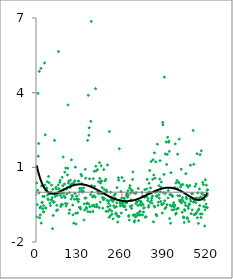
| Category | Series 0 |
|---|---|
| 2.0 | 0.373 |
| 3.0 | -0.991 |
| 4.0 | -0.498 |
| 5.0 | 0.079 |
| 6.0 | 3.972 |
| 7.0 | 1.446 |
| 8.0 | 1.955 |
| 9.0 | -0.031 |
| 10.0 | 4.857 |
| 11.0 | -1.03 |
| 12.0 | -0.632 |
| 13.0 | -0.91 |
| 14.0 | -0.585 |
| 15.0 | 4.978 |
| 16.0 | -1.243 |
| 17.0 | 0.249 |
| 18.0 | -0.422 |
| 19.0 | -0.402 |
| 20.0 | -0.663 |
| 21.0 | -0.166 |
| 22.0 | -0.79 |
| 23.0 | -0.539 |
| 24.0 | -0.791 |
| 25.0 | -0.17 |
| 26.0 | 5.194 |
| 27.0 | 0.29 |
| 28.0 | 2.303 |
| 29.0 | -0.633 |
| 30.0 | -0.636 |
| 31.0 | 0.076 |
| 32.0 | 0.172 |
| 33.0 | 0.142 |
| 34.0 | 0.423 |
| 35.0 | -0.115 |
| 36.0 | -0.266 |
| 37.0 | -0.301 |
| 38.0 | 0.63 |
| 39.0 | -0.058 |
| 40.0 | 0.376 |
| 41.0 | -0.052 |
| 42.0 | -0.432 |
| 43.0 | -0.043 |
| 44.0 | -0.532 |
| 45.0 | 0.003 |
| 46.0 | -0.307 |
| 47.0 | 0.287 |
| 48.0 | -0.319 |
| 49.0 | -0.22 |
| 50.0 | -1.463 |
| 51.0 | 0.117 |
| 52.0 | -0.931 |
| 53.0 | -0.401 |
| 54.0 | -0.395 |
| 55.0 | -0.39 |
| 56.0 | 2.081 |
| 57.0 | -0.071 |
| 58.0 | -0.168 |
| 59.0 | -0.063 |
| 60.0 | 0.198 |
| 61.0 | 0.131 |
| 62.0 | -0.733 |
| 63.0 | -0.526 |
| 64.0 | -0.13 |
| 65.0 | -0.709 |
| 66.0 | -0.064 |
| 67.0 | 0.289 |
| 68.0 | 5.653 |
| 69.0 | 0.136 |
| 70.0 | 0.127 |
| 71.0 | -0.027 |
| 72.0 | 0.397 |
| 73.0 | 0.473 |
| 74.0 | -0.127 |
| 75.0 | -0.575 |
| 76.0 | -0.493 |
| 77.0 | -0.038 |
| 78.0 | -0.214 |
| 79.0 | 0.6 |
| 80.0 | -0.496 |
| 81.0 | 0.259 |
| 82.0 | 1.417 |
| 83.0 | -0.042 |
| 84.0 | 0.103 |
| 85.0 | -0.151 |
| 86.0 | 0.329 |
| 87.0 | 0.804 |
| 88.0 | -0.215 |
| 89.0 | -0.454 |
| 90.0 | 0.972 |
| 91.0 | -0.559 |
| 92.0 | 0.125 |
| 93.0 | -0.07 |
| 94.0 | -0.464 |
| 95.0 | 0.692 |
| 96.0 | 0.961 |
| 97.0 | 3.506 |
| 98.0 | 0.37 |
| 99.0 | 0.443 |
| 100.0 | -0.848 |
| 101.0 | -0.015 |
| 102.0 | -0.713 |
| 103.0 | 0.188 |
| 104.0 | 0.483 |
| 105.0 | 0.296 |
| 106.0 | -0.274 |
| 107.0 | 1.301 |
| 108.0 | 0.328 |
| 109.0 | -0.123 |
| 110.0 | -0.176 |
| 111.0 | -0.516 |
| 112.0 | -0.91 |
| 113.0 | 0.351 |
| 114.0 | -1.244 |
| 115.0 | 0.385 |
| 116.0 | -0.282 |
| 117.0 | 0.459 |
| 118.0 | -0.05 |
| 119.0 | 1.007 |
| 120.0 | -0.843 |
| 121.0 | -1.276 |
| 122.0 | -0.276 |
| 123.0 | -0.159 |
| 124.0 | -0.278 |
| 125.0 | -0.275 |
| 126.0 | -0.831 |
| 127.0 | 0.447 |
| 128.0 | -0.381 |
| 129.0 | -0.289 |
| 130.0 | 0.445 |
| 131.0 | -0.612 |
| 132.0 | 0.156 |
| 133.0 | 0.045 |
| 134.0 | -0.602 |
| 135.0 | -0.677 |
| 136.0 | 0.715 |
| 137.0 | 0.149 |
| 138.0 | 0.653 |
| 139.0 | 0.345 |
| 140.0 | 0.001 |
| 141.0 | 0.06 |
| 142.0 | 0.033 |
| 143.0 | 0.025 |
| 144.0 | 0.176 |
| 145.0 | -1.115 |
| 146.0 | -0.468 |
| 147.0 | -0.718 |
| 148.0 | -0.241 |
| 149.0 | 0.924 |
| 150.0 | 0.563 |
| 151.0 | -0.227 |
| 152.0 | -0.61 |
| 153.0 | -0.657 |
| 154.0 | -0.458 |
| 155.0 | -0.437 |
| 156.0 | 2.081 |
| 157.0 | -0.779 |
| 158.0 | 3.894 |
| 159.0 | -0.473 |
| 160.0 | 2.288 |
| 161.0 | 2.591 |
| 162.0 | 0.541 |
| 163.0 | -0.581 |
| 164.0 | -0.793 |
| 165.0 | -0.098 |
| 166.0 | 2.846 |
| 167.0 | 6.862 |
| 168.0 | 0.265 |
| 169.0 | 0.005 |
| 170.0 | -0.546 |
| 171.0 | -0.189 |
| 172.0 | -0.773 |
| 173.0 | 0.547 |
| 174.0 | -0.522 |
| 175.0 | -0.139 |
| 176.0 | 0.839 |
| 177.0 | 0.236 |
| 178.0 | -0.58 |
| 179.0 | -0.194 |
| 180.0 | 4.161 |
| 181.0 | 1.045 |
| 182.0 | 0.864 |
| 183.0 | -0.492 |
| 184.0 | -0.585 |
| 185.0 | -0.574 |
| 186.0 | 0.907 |
| 187.0 | 0.027 |
| 188.0 | -0.05 |
| 189.0 | 0.422 |
| 190.0 | -0.054 |
| 191.0 | -0.623 |
| 192.0 | 1.189 |
| 193.0 | 0.561 |
| 194.0 | -0.397 |
| 195.0 | 0.37 |
| 196.0 | 0.45 |
| 197.0 | 1.061 |
| 198.0 | -0.061 |
| 199.0 | 0.447 |
| 200.0 | 0.19 |
| 201.0 | -0.214 |
| 202.0 | -0.642 |
| 203.0 | -0.237 |
| 204.0 | -0.305 |
| 205.0 | 0.911 |
| 206.0 | 0.111 |
| 207.0 | -0.257 |
| 208.0 | -0.056 |
| 209.0 | 0.459 |
| 210.0 | -0.013 |
| 211.0 | 0.517 |
| 212.0 | -0.768 |
| 213.0 | 0.087 |
| 214.0 | 0.028 |
| 215.0 | -0.327 |
| 216.0 | 1.095 |
| 217.0 | -0.588 |
| 218.0 | -0.769 |
| 219.0 | -0.443 |
| 220.0 | -0.352 |
| 221.0 | -1.009 |
| 222.0 | 2.44 |
| 223.0 | -0.696 |
| 224.0 | -0.541 |
| 225.0 | -0.941 |
| 226.0 | 0 |
| 227.0 | -0.298 |
| 228.0 | -0.204 |
| 229.0 | -0.755 |
| 230.0 | -0.878 |
| 231.0 | -0.332 |
| 232.0 | -0.369 |
| 233.0 | -1.07 |
| 234.0 | -0.325 |
| 235.0 | -0.544 |
| 236.0 | -0.124 |
| 237.0 | -0.274 |
| 238.0 | -0.614 |
| 239.0 | -0.234 |
| 240.0 | -0.072 |
| 241.0 | -0.866 |
| 242.0 | -0.832 |
| 243.0 | -0.575 |
| 244.0 | -0.423 |
| 245.0 | 0.186 |
| 246.0 | -0.936 |
| 247.0 | -1.2 |
| 248.0 | -0.969 |
| 249.0 | 0.578 |
| 250.0 | 0.482 |
| 251.0 | -0.975 |
| 252.0 | 1.75 |
| 253.0 | -0.323 |
| 254.0 | -0.44 |
| 255.0 | -0.549 |
| 256.0 | -0.469 |
| 257.0 | 0.029 |
| 258.0 | -0.838 |
| 259.0 | -0.233 |
| 260.0 | 0.588 |
| 261.0 | -0.39 |
| 262.0 | -0.537 |
| 263.0 | -0.451 |
| 264.0 | -0.237 |
| 265.0 | -0.572 |
| 266.0 | 0.453 |
| 267.0 | -0.248 |
| 268.0 | -0.546 |
| 269.0 | -0.576 |
| 270.0 | -0.357 |
| 271.0 | -0.412 |
| 272.0 | -0.702 |
| 273.0 | -0.124 |
| 274.0 | -0.426 |
| 275.0 | -0.052 |
| 276.0 | -0.157 |
| 277.0 | -0.204 |
| 278.0 | 0.06 |
| 279.0 | -0.118 |
| 280.0 | -0.968 |
| 281.0 | -0.938 |
| 282.0 | -1.119 |
| 283.0 | 0.165 |
| 284.0 | 0.265 |
| 285.0 | -0.574 |
| 286.0 | -0.033 |
| 287.0 | -0.306 |
| 288.0 | 0.096 |
| 289.0 | -0.652 |
| 290.0 | -0.537 |
| 291.0 | 0.057 |
| 292.0 | 0.513 |
| 293.0 | 0.817 |
| 294.0 | -0.919 |
| 295.0 | -0.932 |
| 296.0 | -0.025 |
| 297.0 | -1.2 |
| 298.0 | -1.143 |
| 299.0 | -0.902 |
| 300.0 | -0.045 |
| 301.0 | -0.995 |
| 302.0 | -0.462 |
| 303.0 | -0.021 |
| 304.0 | -0.4 |
| 305.0 | -0.382 |
| 306.0 | -0.939 |
| 307.0 | -0.846 |
| 308.0 | -0.532 |
| 309.0 | 0.151 |
| 310.0 | -1.141 |
| 311.0 | -0.349 |
| 312.0 | -0.914 |
| 313.0 | -0.797 |
| 314.0 | -0.485 |
| 315.0 | -0.764 |
| 316.0 | -0.912 |
| 317.0 | -0.366 |
| 318.0 | -0.526 |
| 319.0 | -0.418 |
| 320.0 | -0.007 |
| 321.0 | -0.167 |
| 322.0 | -0.912 |
| 323.0 | -0.148 |
| 324.0 | -0.498 |
| 325.0 | -0.797 |
| 326.0 | -0.641 |
| 327.0 | -0.619 |
| 328.0 | -0.195 |
| 329.0 | 0.106 |
| 330.0 | -1.004 |
| 331.0 | -0.182 |
| 332.0 | -0.134 |
| 333.0 | -0.985 |
| 334.0 | -0.164 |
| 335.0 | 0.125 |
| 336.0 | 0.515 |
| 337.0 | -0.034 |
| 338.0 | -0.34 |
| 339.0 | -0.254 |
| 340.0 | -0.606 |
| 341.0 | -0.533 |
| 342.0 | 0.359 |
| 343.0 | 0.007 |
| 344.0 | 0.87 |
| 345.0 | -0.409 |
| 346.0 | 0.172 |
| 347.0 | -0.037 |
| 348.0 | 1.234 |
| 349.0 | -0.324 |
| 350.0 | -0.234 |
| 351.0 | -0.438 |
| 352.0 | -0.15 |
| 353.0 | 0.52 |
| 354.0 | 1.306 |
| 355.0 | -1.189 |
| 356.0 | 0.692 |
| 357.0 | -0.553 |
| 358.0 | 1.582 |
| 359.0 | -0.597 |
| 360.0 | 0.564 |
| 361.0 | -0.013 |
| 362.0 | 1.219 |
| 363.0 | -0.894 |
| 364.0 | -0.156 |
| 365.0 | -0.949 |
| 366.0 | -0.171 |
| 367.0 | 1.929 |
| 368.0 | 0.033 |
| 369.0 | -0.528 |
| 370.0 | -0.397 |
| 371.0 | -0.1 |
| 372.0 | 0.262 |
| 373.0 | -0.24 |
| 374.0 | 0.528 |
| 375.0 | 1.266 |
| 376.0 | 0.015 |
| 377.0 | -0.372 |
| 378.0 | 0.202 |
| 379.0 | 0.411 |
| 380.0 | -0.476 |
| 381.0 | -0.507 |
| 382.0 | -0.836 |
| 383.0 | 2.803 |
| 384.0 | 2.705 |
| 385.0 | -0.016 |
| 386.0 | -0.451 |
| 387.0 | 0.716 |
| 388.0 | 4.623 |
| 389.0 | -0.342 |
| 390.0 | -0.662 |
| 391.0 | 1.54 |
| 392.0 | -0.03 |
| 393.0 | -0.603 |
| 394.0 | 2.014 |
| 395.0 | 1.113 |
| 396.0 | -0.5 |
| 397.0 | 1.519 |
| 398.0 | 2.205 |
| 399.0 | -0.228 |
| 400.0 | 0.063 |
| 401.0 | 2.013 |
| 402.0 | 2.055 |
| 403.0 | 1.639 |
| 404.0 | -1.057 |
| 405.0 | -0.091 |
| 406.0 | -0.523 |
| 407.0 | -1.248 |
| 408.0 | 0.782 |
| 409.0 | -0.562 |
| 410.0 | -0.11 |
| 411.0 | -0.708 |
| 412.0 | -0.165 |
| 413.0 | -0.162 |
| 414.0 | -0.523 |
| 415.0 | -0.566 |
| 416.0 | -0.419 |
| 417.0 | -0.701 |
| 418.0 | -0.589 |
| 419.0 | 0.191 |
| 420.0 | -0.515 |
| 421.0 | 1.942 |
| 422.0 | -0.884 |
| 423.0 | 0.365 |
| 424.0 | -0.839 |
| 425.0 | -0.676 |
| 426.0 | 0.469 |
| 427.0 | 0.147 |
| 428.0 | 1.527 |
| 429.0 | -0.136 |
| 430.0 | -0.641 |
| 431.0 | 0.399 |
| 432.0 | 0.375 |
| 433.0 | 2.135 |
| 434.0 | -0.323 |
| 435.0 | -0.144 |
| 436.0 | -0.377 |
| 437.0 | 0.214 |
| 438.0 | 0.297 |
| 439.0 | 0.926 |
| 440.0 | -0.431 |
| 441.0 | -0.3 |
| 442.0 | -0.807 |
| 443.0 | -0.218 |
| 444.0 | 0.31 |
| 445.0 | -0.358 |
| 446.0 | -0.99 |
| 447.0 | -1.034 |
| 448.0 | -1.214 |
| 449.0 | -0.7 |
| 450.0 | -0.731 |
| 451.0 | -0.428 |
| 452.0 | -0.529 |
| 453.0 | 0.745 |
| 454.0 | -0.2 |
| 455.0 | -0.264 |
| 456.0 | 0.277 |
| 457.0 | -1.021 |
| 458.0 | -1.065 |
| 459.0 | -0.565 |
| 460.0 | 0.208 |
| 461.0 | -0.643 |
| 462.0 | -1.178 |
| 463.0 | -0.467 |
| 464.0 | -0.501 |
| 465.0 | 0.27 |
| 466.0 | -0.27 |
| 467.0 | 1.082 |
| 468.0 | -0.357 |
| 469.0 | -0.858 |
| 470.0 | -0.219 |
| 471.0 | -0.064 |
| 472.0 | -0.709 |
| 473.0 | -0.053 |
| 474.0 | -0.253 |
| 475.0 | 2.481 |
| 476.0 | -0.401 |
| 477.0 | 1.122 |
| 478.0 | -0.899 |
| 479.0 | -0.353 |
| 480.0 | -0.273 |
| 481.0 | 0.239 |
| 482.0 | -0.884 |
| 483.0 | -0.415 |
| 484.0 | 0.332 |
| 485.0 | -0.23 |
| 486.0 | -0.814 |
| 487.0 | 1.545 |
| 488.0 | -1.026 |
| 489.0 | -0.03 |
| 490.0 | -0.729 |
| 491.0 | -1.254 |
| 492.0 | -0.679 |
| 493.0 | -0.235 |
| 494.0 | 0.13 |
| 495.0 | -0.537 |
| 496.0 | 1.511 |
| 497.0 | -0.873 |
| 498.0 | -0.192 |
| 499.0 | -1.015 |
| 500.0 | 1.666 |
| 501.0 | -0.035 |
| 502.0 | -0.872 |
| 503.0 | -0.079 |
| 504.0 | 0.395 |
| 505.0 | -0.233 |
| 506.0 | 0.305 |
| 507.0 | -0.576 |
| 508.0 | -0.104 |
| 509.0 | -0.308 |
| 510.0 | -1.36 |
| 511.0 | -0.713 |
| 512.0 | 0.499 |
| 513.0 | -0.598 |
| 514.0 | -0.476 |
| 515.0 | 0.283 |
| 516.0 | -0.14 |
| 517.0 | 0.083 |
| 518.0 | -0.621 |
| 519.0 | 0.097 |